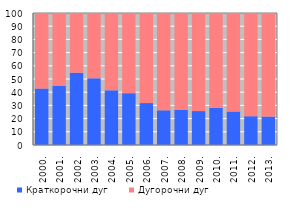
| Category | Краткорочни дуг | Дугорочни дуг |
|---|---|---|
| 2000. | 42.782 | 57.218 |
| 2001. | 44.929 | 55.071 |
| 2002. | 54.822 | 45.178 |
| 2003. | 50.509 | 49.491 |
| 2004. | 41.394 | 58.606 |
| 2005. | 39.271 | 60.729 |
| 2006. | 31.754 | 68.246 |
| 2007. | 26.26 | 73.74 |
| 2008. | 26.566 | 73.434 |
| 2009. | 25.683 | 74.317 |
| 2010. | 28.185 | 71.815 |
| 2011. | 25.37 | 74.63 |
| 2012. | 21.819 | 78.181 |
| 2013. | 21.51 | 78.49 |